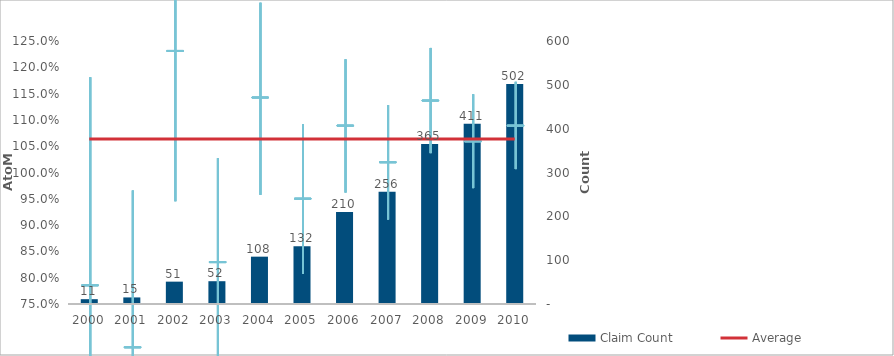
| Category | Claim Count |
|---|---|
| 0 | 11 |
| 1 | 15 |
| 2 | 51 |
| 3 | 52 |
| 4 | 108 |
| 5 | 132 |
| 6 | 210 |
| 7 | 256 |
| 8 | 365 |
| 9 | 411 |
| 10 | 502 |